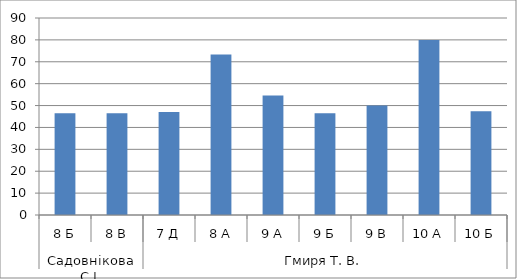
| Category | Series 0 |
|---|---|
| 0 | 46.429 |
| 1 | 46.429 |
| 2 | 47.059 |
| 3 | 73.333 |
| 4 | 54.545 |
| 5 | 46.429 |
| 6 | 50 |
| 7 | 80 |
| 8 | 47.368 |